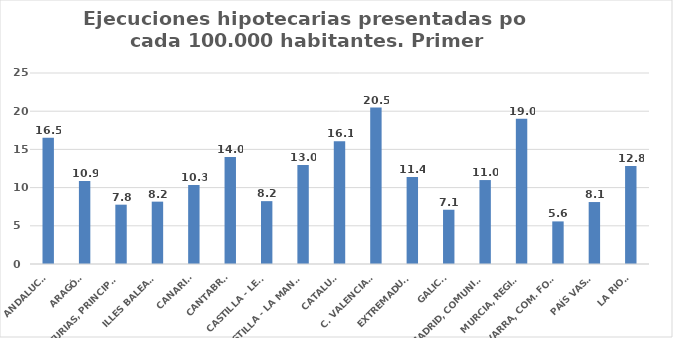
| Category | Series 0 |
|---|---|
| ANDALUCÍA | 16.521 |
| ARAGÓN | 10.865 |
| ASTURIAS, PRINCIPADO | 7.765 |
| ILLES BALEARS | 8.162 |
| CANARIAS | 10.338 |
| CANTABRIA | 14.012 |
| CASTILLA - LEÓN | 8.228 |
| CASTILLA - LA MANCHA | 12.962 |
| CATALUÑA | 16.073 |
| C. VALENCIANA | 20.468 |
| EXTREMADURA | 11.383 |
| GALICIA | 7.103 |
| MADRID, COMUNIDAD | 10.987 |
| MURCIA, REGIÓN | 19.002 |
| NAVARRA, COM. FORAL | 5.576 |
| PAÍS VASCO | 8.11 |
| LA RIOJA | 12.833 |